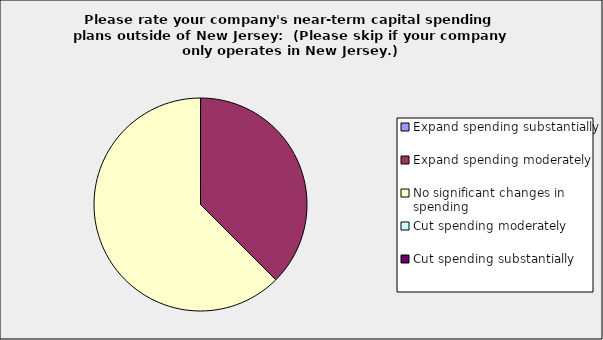
| Category | Series 0 |
|---|---|
| Expand spending substantially | 0 |
| Expand spending moderately | 0.375 |
| No significant changes in spending | 0.625 |
| Cut spending moderately | 0 |
| Cut spending substantially | 0 |